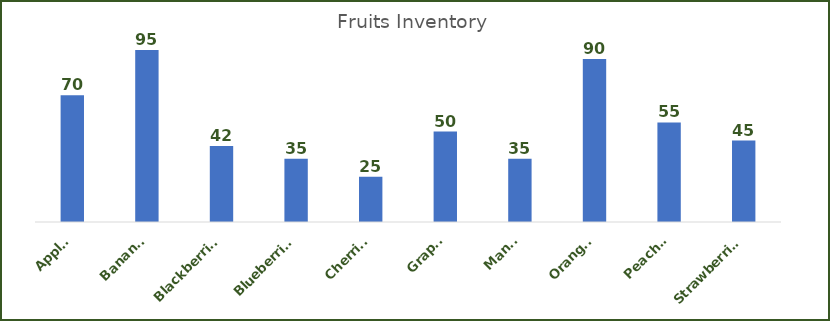
| Category | Quantity |
|---|---|
| Apples | 70 |
| Bananas | 95 |
| Blackberries | 42 |
| Blueberries | 35 |
| Cherries | 25 |
| Grapes | 50 |
| Mango | 35 |
| Oranges | 90 |
| Peaches | 55 |
| Strawberries | 45 |